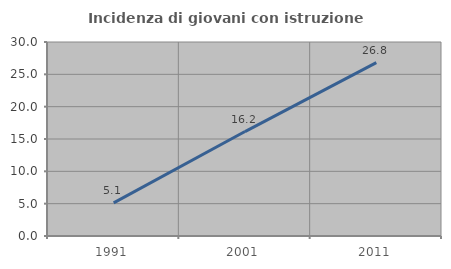
| Category | Incidenza di giovani con istruzione universitaria |
|---|---|
| 1991.0 | 5.128 |
| 2001.0 | 16.151 |
| 2011.0 | 26.818 |